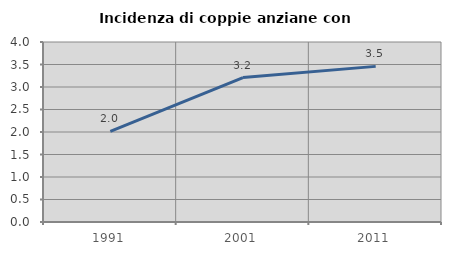
| Category | Incidenza di coppie anziane con figli |
|---|---|
| 1991.0 | 2.013 |
| 2001.0 | 3.211 |
| 2011.0 | 3.458 |